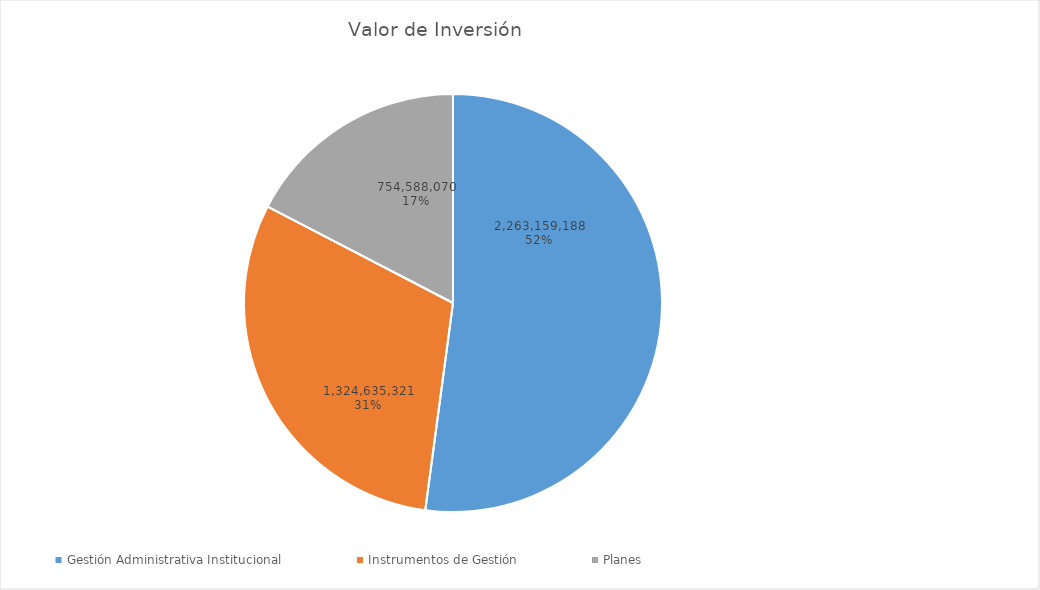
| Category | Valor de Inversión | Porcentaje de Ejecución dentro de la Actividad |
|---|---|---|
| Gestión Administrativa Institucional | 2263159188 | 8 |
| Instrumentos de Gestión | 1324635321 | 8 |
| Planes | 754588070 | 6 |